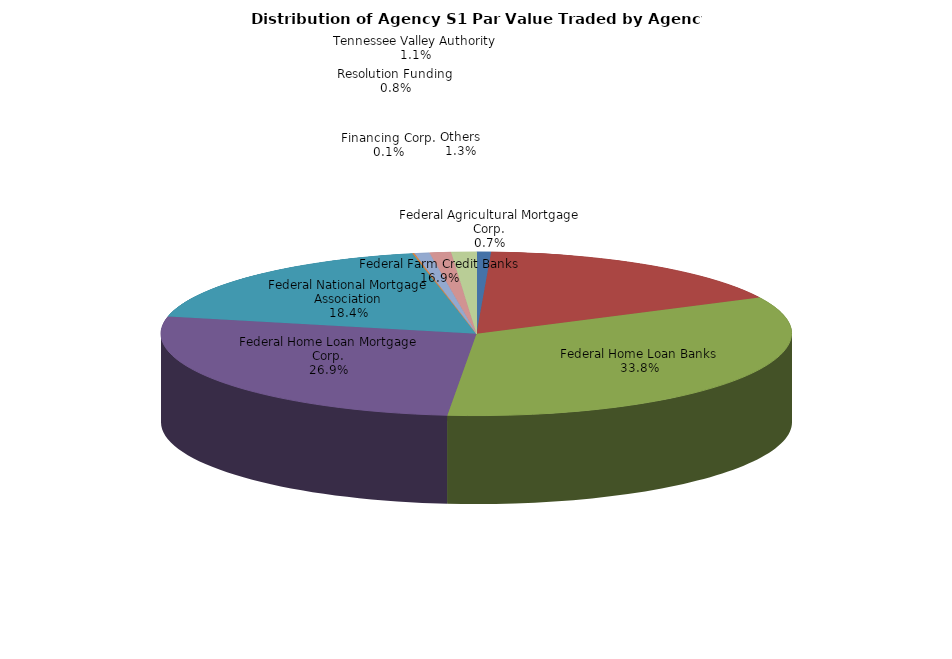
| Category | Series 0 |
|---|---|
| Federal Agricultural Mortgage Corp. | 30766243.028 |
| Federal Farm Credit Banks | 703574629.482 |
| Federal Home Loan Banks | 1402867033.032 |
| Federal Home Loan Mortgage Corp. | 1117337405.675 |
| Federal National Mortgage Association | 762862313.444 |
| Financing Corp. | 4092131.474 |
| Resolution Funding | 32011326.693 |
| Tennessee Valley Authority | 45367661.476 |
| Others | 53316203.327 |